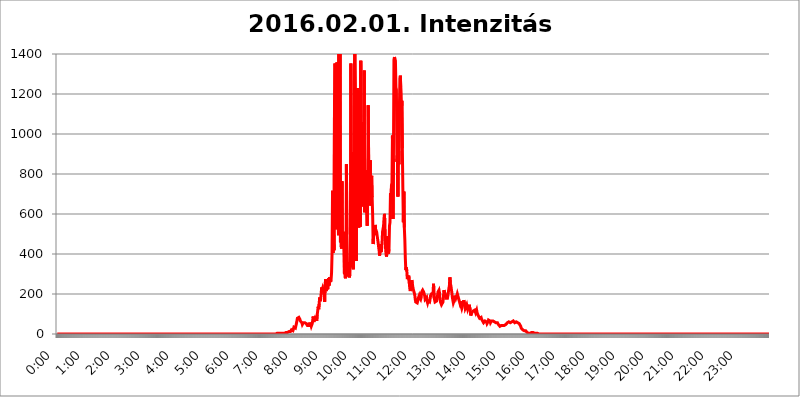
| Category | 2016.02.01. Intenzitás [W/m^2] |
|---|---|
| 0.0 | 0 |
| 0.0006944444444444445 | 0 |
| 0.001388888888888889 | 0 |
| 0.0020833333333333333 | 0 |
| 0.002777777777777778 | 0 |
| 0.003472222222222222 | 0 |
| 0.004166666666666667 | 0 |
| 0.004861111111111111 | 0 |
| 0.005555555555555556 | 0 |
| 0.0062499999999999995 | 0 |
| 0.006944444444444444 | 0 |
| 0.007638888888888889 | 0 |
| 0.008333333333333333 | 0 |
| 0.009027777777777779 | 0 |
| 0.009722222222222222 | 0 |
| 0.010416666666666666 | 0 |
| 0.011111111111111112 | 0 |
| 0.011805555555555555 | 0 |
| 0.012499999999999999 | 0 |
| 0.013194444444444444 | 0 |
| 0.013888888888888888 | 0 |
| 0.014583333333333332 | 0 |
| 0.015277777777777777 | 0 |
| 0.015972222222222224 | 0 |
| 0.016666666666666666 | 0 |
| 0.017361111111111112 | 0 |
| 0.018055555555555557 | 0 |
| 0.01875 | 0 |
| 0.019444444444444445 | 0 |
| 0.02013888888888889 | 0 |
| 0.020833333333333332 | 0 |
| 0.02152777777777778 | 0 |
| 0.022222222222222223 | 0 |
| 0.02291666666666667 | 0 |
| 0.02361111111111111 | 0 |
| 0.024305555555555556 | 0 |
| 0.024999999999999998 | 0 |
| 0.025694444444444447 | 0 |
| 0.02638888888888889 | 0 |
| 0.027083333333333334 | 0 |
| 0.027777777777777776 | 0 |
| 0.02847222222222222 | 0 |
| 0.029166666666666664 | 0 |
| 0.029861111111111113 | 0 |
| 0.030555555555555555 | 0 |
| 0.03125 | 0 |
| 0.03194444444444445 | 0 |
| 0.03263888888888889 | 0 |
| 0.03333333333333333 | 0 |
| 0.034027777777777775 | 0 |
| 0.034722222222222224 | 0 |
| 0.035416666666666666 | 0 |
| 0.036111111111111115 | 0 |
| 0.03680555555555556 | 0 |
| 0.0375 | 0 |
| 0.03819444444444444 | 0 |
| 0.03888888888888889 | 0 |
| 0.03958333333333333 | 0 |
| 0.04027777777777778 | 0 |
| 0.04097222222222222 | 0 |
| 0.041666666666666664 | 0 |
| 0.042361111111111106 | 0 |
| 0.04305555555555556 | 0 |
| 0.043750000000000004 | 0 |
| 0.044444444444444446 | 0 |
| 0.04513888888888889 | 0 |
| 0.04583333333333334 | 0 |
| 0.04652777777777778 | 0 |
| 0.04722222222222222 | 0 |
| 0.04791666666666666 | 0 |
| 0.04861111111111111 | 0 |
| 0.049305555555555554 | 0 |
| 0.049999999999999996 | 0 |
| 0.05069444444444445 | 0 |
| 0.051388888888888894 | 0 |
| 0.052083333333333336 | 0 |
| 0.05277777777777778 | 0 |
| 0.05347222222222222 | 0 |
| 0.05416666666666667 | 0 |
| 0.05486111111111111 | 0 |
| 0.05555555555555555 | 0 |
| 0.05625 | 0 |
| 0.05694444444444444 | 0 |
| 0.057638888888888885 | 0 |
| 0.05833333333333333 | 0 |
| 0.05902777777777778 | 0 |
| 0.059722222222222225 | 0 |
| 0.06041666666666667 | 0 |
| 0.061111111111111116 | 0 |
| 0.06180555555555556 | 0 |
| 0.0625 | 0 |
| 0.06319444444444444 | 0 |
| 0.06388888888888888 | 0 |
| 0.06458333333333334 | 0 |
| 0.06527777777777778 | 0 |
| 0.06597222222222222 | 0 |
| 0.06666666666666667 | 0 |
| 0.06736111111111111 | 0 |
| 0.06805555555555555 | 0 |
| 0.06874999999999999 | 0 |
| 0.06944444444444443 | 0 |
| 0.07013888888888889 | 0 |
| 0.07083333333333333 | 0 |
| 0.07152777777777779 | 0 |
| 0.07222222222222223 | 0 |
| 0.07291666666666667 | 0 |
| 0.07361111111111111 | 0 |
| 0.07430555555555556 | 0 |
| 0.075 | 0 |
| 0.07569444444444444 | 0 |
| 0.0763888888888889 | 0 |
| 0.07708333333333334 | 0 |
| 0.07777777777777778 | 0 |
| 0.07847222222222222 | 0 |
| 0.07916666666666666 | 0 |
| 0.0798611111111111 | 0 |
| 0.08055555555555556 | 0 |
| 0.08125 | 0 |
| 0.08194444444444444 | 0 |
| 0.08263888888888889 | 0 |
| 0.08333333333333333 | 0 |
| 0.08402777777777777 | 0 |
| 0.08472222222222221 | 0 |
| 0.08541666666666665 | 0 |
| 0.08611111111111112 | 0 |
| 0.08680555555555557 | 0 |
| 0.08750000000000001 | 0 |
| 0.08819444444444445 | 0 |
| 0.08888888888888889 | 0 |
| 0.08958333333333333 | 0 |
| 0.09027777777777778 | 0 |
| 0.09097222222222222 | 0 |
| 0.09166666666666667 | 0 |
| 0.09236111111111112 | 0 |
| 0.09305555555555556 | 0 |
| 0.09375 | 0 |
| 0.09444444444444444 | 0 |
| 0.09513888888888888 | 0 |
| 0.09583333333333333 | 0 |
| 0.09652777777777777 | 0 |
| 0.09722222222222222 | 0 |
| 0.09791666666666667 | 0 |
| 0.09861111111111111 | 0 |
| 0.09930555555555555 | 0 |
| 0.09999999999999999 | 0 |
| 0.10069444444444443 | 0 |
| 0.1013888888888889 | 0 |
| 0.10208333333333335 | 0 |
| 0.10277777777777779 | 0 |
| 0.10347222222222223 | 0 |
| 0.10416666666666667 | 0 |
| 0.10486111111111111 | 0 |
| 0.10555555555555556 | 0 |
| 0.10625 | 0 |
| 0.10694444444444444 | 0 |
| 0.1076388888888889 | 0 |
| 0.10833333333333334 | 0 |
| 0.10902777777777778 | 0 |
| 0.10972222222222222 | 0 |
| 0.1111111111111111 | 0 |
| 0.11180555555555556 | 0 |
| 0.11180555555555556 | 0 |
| 0.1125 | 0 |
| 0.11319444444444444 | 0 |
| 0.11388888888888889 | 0 |
| 0.11458333333333333 | 0 |
| 0.11527777777777777 | 0 |
| 0.11597222222222221 | 0 |
| 0.11666666666666665 | 0 |
| 0.1173611111111111 | 0 |
| 0.11805555555555557 | 0 |
| 0.11944444444444445 | 0 |
| 0.12013888888888889 | 0 |
| 0.12083333333333333 | 0 |
| 0.12152777777777778 | 0 |
| 0.12222222222222223 | 0 |
| 0.12291666666666667 | 0 |
| 0.12291666666666667 | 0 |
| 0.12361111111111112 | 0 |
| 0.12430555555555556 | 0 |
| 0.125 | 0 |
| 0.12569444444444444 | 0 |
| 0.12638888888888888 | 0 |
| 0.12708333333333333 | 0 |
| 0.16875 | 0 |
| 0.12847222222222224 | 0 |
| 0.12916666666666668 | 0 |
| 0.12986111111111112 | 0 |
| 0.13055555555555556 | 0 |
| 0.13125 | 0 |
| 0.13194444444444445 | 0 |
| 0.1326388888888889 | 0 |
| 0.13333333333333333 | 0 |
| 0.13402777777777777 | 0 |
| 0.13402777777777777 | 0 |
| 0.13472222222222222 | 0 |
| 0.13541666666666666 | 0 |
| 0.1361111111111111 | 0 |
| 0.13749999999999998 | 0 |
| 0.13819444444444443 | 0 |
| 0.1388888888888889 | 0 |
| 0.13958333333333334 | 0 |
| 0.14027777777777778 | 0 |
| 0.14097222222222222 | 0 |
| 0.14166666666666666 | 0 |
| 0.1423611111111111 | 0 |
| 0.14305555555555557 | 0 |
| 0.14375000000000002 | 0 |
| 0.14444444444444446 | 0 |
| 0.1451388888888889 | 0 |
| 0.1451388888888889 | 0 |
| 0.14652777777777778 | 0 |
| 0.14722222222222223 | 0 |
| 0.14791666666666667 | 0 |
| 0.1486111111111111 | 0 |
| 0.14930555555555555 | 0 |
| 0.15 | 0 |
| 0.15069444444444444 | 0 |
| 0.15138888888888888 | 0 |
| 0.15208333333333332 | 0 |
| 0.15277777777777776 | 0 |
| 0.15347222222222223 | 0 |
| 0.15416666666666667 | 0 |
| 0.15486111111111112 | 0 |
| 0.15555555555555556 | 0 |
| 0.15625 | 0 |
| 0.15694444444444444 | 0 |
| 0.15763888888888888 | 0 |
| 0.15833333333333333 | 0 |
| 0.15902777777777777 | 0 |
| 0.15972222222222224 | 0 |
| 0.16041666666666668 | 0 |
| 0.16111111111111112 | 0 |
| 0.16180555555555556 | 0 |
| 0.1625 | 0 |
| 0.16319444444444445 | 0 |
| 0.1638888888888889 | 0 |
| 0.16458333333333333 | 0 |
| 0.16527777777777777 | 0 |
| 0.16597222222222222 | 0 |
| 0.16666666666666666 | 0 |
| 0.1673611111111111 | 0 |
| 0.16805555555555554 | 0 |
| 0.16874999999999998 | 0 |
| 0.16944444444444443 | 0 |
| 0.17013888888888887 | 0 |
| 0.1708333333333333 | 0 |
| 0.17152777777777775 | 0 |
| 0.17222222222222225 | 0 |
| 0.1729166666666667 | 0 |
| 0.17361111111111113 | 0 |
| 0.17430555555555557 | 0 |
| 0.17500000000000002 | 0 |
| 0.17569444444444446 | 0 |
| 0.1763888888888889 | 0 |
| 0.17708333333333334 | 0 |
| 0.17777777777777778 | 0 |
| 0.17847222222222223 | 0 |
| 0.17916666666666667 | 0 |
| 0.1798611111111111 | 0 |
| 0.18055555555555555 | 0 |
| 0.18125 | 0 |
| 0.18194444444444444 | 0 |
| 0.1826388888888889 | 0 |
| 0.18333333333333335 | 0 |
| 0.1840277777777778 | 0 |
| 0.18472222222222223 | 0 |
| 0.18541666666666667 | 0 |
| 0.18611111111111112 | 0 |
| 0.18680555555555556 | 0 |
| 0.1875 | 0 |
| 0.18819444444444444 | 0 |
| 0.18888888888888888 | 0 |
| 0.18958333333333333 | 0 |
| 0.19027777777777777 | 0 |
| 0.1909722222222222 | 0 |
| 0.19166666666666665 | 0 |
| 0.19236111111111112 | 0 |
| 0.19305555555555554 | 0 |
| 0.19375 | 0 |
| 0.19444444444444445 | 0 |
| 0.1951388888888889 | 0 |
| 0.19583333333333333 | 0 |
| 0.19652777777777777 | 0 |
| 0.19722222222222222 | 0 |
| 0.19791666666666666 | 0 |
| 0.1986111111111111 | 0 |
| 0.19930555555555554 | 0 |
| 0.19999999999999998 | 0 |
| 0.20069444444444443 | 0 |
| 0.20138888888888887 | 0 |
| 0.2020833333333333 | 0 |
| 0.2027777777777778 | 0 |
| 0.2034722222222222 | 0 |
| 0.2041666666666667 | 0 |
| 0.20486111111111113 | 0 |
| 0.20555555555555557 | 0 |
| 0.20625000000000002 | 0 |
| 0.20694444444444446 | 0 |
| 0.2076388888888889 | 0 |
| 0.20833333333333334 | 0 |
| 0.20902777777777778 | 0 |
| 0.20972222222222223 | 0 |
| 0.21041666666666667 | 0 |
| 0.2111111111111111 | 0 |
| 0.21180555555555555 | 0 |
| 0.2125 | 0 |
| 0.21319444444444444 | 0 |
| 0.2138888888888889 | 0 |
| 0.21458333333333335 | 0 |
| 0.2152777777777778 | 0 |
| 0.21597222222222223 | 0 |
| 0.21666666666666667 | 0 |
| 0.21736111111111112 | 0 |
| 0.21805555555555556 | 0 |
| 0.21875 | 0 |
| 0.21944444444444444 | 0 |
| 0.22013888888888888 | 0 |
| 0.22083333333333333 | 0 |
| 0.22152777777777777 | 0 |
| 0.2222222222222222 | 0 |
| 0.22291666666666665 | 0 |
| 0.2236111111111111 | 0 |
| 0.22430555555555556 | 0 |
| 0.225 | 0 |
| 0.22569444444444445 | 0 |
| 0.2263888888888889 | 0 |
| 0.22708333333333333 | 0 |
| 0.22777777777777777 | 0 |
| 0.22847222222222222 | 0 |
| 0.22916666666666666 | 0 |
| 0.2298611111111111 | 0 |
| 0.23055555555555554 | 0 |
| 0.23124999999999998 | 0 |
| 0.23194444444444443 | 0 |
| 0.23263888888888887 | 0 |
| 0.2333333333333333 | 0 |
| 0.2340277777777778 | 0 |
| 0.2347222222222222 | 0 |
| 0.2354166666666667 | 0 |
| 0.23611111111111113 | 0 |
| 0.23680555555555557 | 0 |
| 0.23750000000000002 | 0 |
| 0.23819444444444446 | 0 |
| 0.2388888888888889 | 0 |
| 0.23958333333333334 | 0 |
| 0.24027777777777778 | 0 |
| 0.24097222222222223 | 0 |
| 0.24166666666666667 | 0 |
| 0.2423611111111111 | 0 |
| 0.24305555555555555 | 0 |
| 0.24375 | 0 |
| 0.24444444444444446 | 0 |
| 0.24513888888888888 | 0 |
| 0.24583333333333335 | 0 |
| 0.2465277777777778 | 0 |
| 0.24722222222222223 | 0 |
| 0.24791666666666667 | 0 |
| 0.24861111111111112 | 0 |
| 0.24930555555555556 | 0 |
| 0.25 | 0 |
| 0.25069444444444444 | 0 |
| 0.2513888888888889 | 0 |
| 0.2520833333333333 | 0 |
| 0.25277777777777777 | 0 |
| 0.2534722222222222 | 0 |
| 0.25416666666666665 | 0 |
| 0.2548611111111111 | 0 |
| 0.2555555555555556 | 0 |
| 0.25625000000000003 | 0 |
| 0.2569444444444445 | 0 |
| 0.2576388888888889 | 0 |
| 0.25833333333333336 | 0 |
| 0.2590277777777778 | 0 |
| 0.25972222222222224 | 0 |
| 0.2604166666666667 | 0 |
| 0.2611111111111111 | 0 |
| 0.26180555555555557 | 0 |
| 0.2625 | 0 |
| 0.26319444444444445 | 0 |
| 0.2638888888888889 | 0 |
| 0.26458333333333334 | 0 |
| 0.2652777777777778 | 0 |
| 0.2659722222222222 | 0 |
| 0.26666666666666666 | 0 |
| 0.2673611111111111 | 0 |
| 0.26805555555555555 | 0 |
| 0.26875 | 0 |
| 0.26944444444444443 | 0 |
| 0.2701388888888889 | 0 |
| 0.2708333333333333 | 0 |
| 0.27152777777777776 | 0 |
| 0.2722222222222222 | 0 |
| 0.27291666666666664 | 0 |
| 0.2736111111111111 | 0 |
| 0.2743055555555555 | 0 |
| 0.27499999999999997 | 0 |
| 0.27569444444444446 | 0 |
| 0.27638888888888885 | 0 |
| 0.27708333333333335 | 0 |
| 0.2777777777777778 | 0 |
| 0.27847222222222223 | 0 |
| 0.2791666666666667 | 0 |
| 0.2798611111111111 | 0 |
| 0.28055555555555556 | 0 |
| 0.28125 | 0 |
| 0.28194444444444444 | 0 |
| 0.2826388888888889 | 0 |
| 0.2833333333333333 | 0 |
| 0.28402777777777777 | 0 |
| 0.2847222222222222 | 0 |
| 0.28541666666666665 | 0 |
| 0.28611111111111115 | 0 |
| 0.28680555555555554 | 0 |
| 0.28750000000000003 | 0 |
| 0.2881944444444445 | 0 |
| 0.2888888888888889 | 0 |
| 0.28958333333333336 | 0 |
| 0.2902777777777778 | 0 |
| 0.29097222222222224 | 0 |
| 0.2916666666666667 | 0 |
| 0.2923611111111111 | 0 |
| 0.29305555555555557 | 0 |
| 0.29375 | 0 |
| 0.29444444444444445 | 0 |
| 0.2951388888888889 | 0 |
| 0.29583333333333334 | 0 |
| 0.2965277777777778 | 0 |
| 0.2972222222222222 | 0 |
| 0.29791666666666666 | 0 |
| 0.2986111111111111 | 0 |
| 0.29930555555555555 | 0 |
| 0.3 | 0 |
| 0.30069444444444443 | 0 |
| 0.3013888888888889 | 0 |
| 0.3020833333333333 | 0 |
| 0.30277777777777776 | 0 |
| 0.3034722222222222 | 0 |
| 0.30416666666666664 | 0 |
| 0.3048611111111111 | 0 |
| 0.3055555555555555 | 0 |
| 0.30624999999999997 | 0 |
| 0.3069444444444444 | 0 |
| 0.3076388888888889 | 3.525 |
| 0.30833333333333335 | 3.525 |
| 0.3090277777777778 | 3.525 |
| 0.30972222222222223 | 3.525 |
| 0.3104166666666667 | 3.525 |
| 0.3111111111111111 | 3.525 |
| 0.31180555555555556 | 3.525 |
| 0.3125 | 3.525 |
| 0.31319444444444444 | 3.525 |
| 0.3138888888888889 | 3.525 |
| 0.3145833333333333 | 3.525 |
| 0.31527777777777777 | 3.525 |
| 0.3159722222222222 | 3.525 |
| 0.31666666666666665 | 3.525 |
| 0.31736111111111115 | 3.525 |
| 0.31805555555555554 | 3.525 |
| 0.31875000000000003 | 3.525 |
| 0.3194444444444445 | 3.525 |
| 0.3201388888888889 | 7.887 |
| 0.32083333333333336 | 7.887 |
| 0.3215277777777778 | 7.887 |
| 0.32222222222222224 | 7.887 |
| 0.3229166666666667 | 7.887 |
| 0.3236111111111111 | 12.257 |
| 0.32430555555555557 | 12.257 |
| 0.325 | 12.257 |
| 0.32569444444444445 | 12.257 |
| 0.3263888888888889 | 16.636 |
| 0.32708333333333334 | 12.257 |
| 0.3277777777777778 | 16.636 |
| 0.3284722222222222 | 21.024 |
| 0.32916666666666666 | 21.024 |
| 0.3298611111111111 | 16.636 |
| 0.33055555555555555 | 16.636 |
| 0.33125 | 21.024 |
| 0.33194444444444443 | 34.234 |
| 0.3326388888888889 | 34.234 |
| 0.3333333333333333 | 29.823 |
| 0.3340277777777778 | 29.823 |
| 0.3347222222222222 | 34.234 |
| 0.3354166666666667 | 51.951 |
| 0.3361111111111111 | 65.31 |
| 0.3368055555555556 | 78.722 |
| 0.33749999999999997 | 74.246 |
| 0.33819444444444446 | 78.722 |
| 0.33888888888888885 | 83.205 |
| 0.33958333333333335 | 83.205 |
| 0.34027777777777773 | 74.246 |
| 0.34097222222222223 | 65.31 |
| 0.3416666666666666 | 65.31 |
| 0.3423611111111111 | 60.85 |
| 0.3430555555555555 | 56.398 |
| 0.34375 | 47.511 |
| 0.3444444444444445 | 51.951 |
| 0.3451388888888889 | 56.398 |
| 0.3458333333333334 | 51.951 |
| 0.34652777777777777 | 60.85 |
| 0.34722222222222227 | 56.398 |
| 0.34791666666666665 | 56.398 |
| 0.34861111111111115 | 56.398 |
| 0.34930555555555554 | 51.951 |
| 0.35000000000000003 | 47.511 |
| 0.3506944444444444 | 43.079 |
| 0.3513888888888889 | 47.511 |
| 0.3520833333333333 | 47.511 |
| 0.3527777777777778 | 43.079 |
| 0.3534722222222222 | 56.398 |
| 0.3541666666666667 | 38.653 |
| 0.3548611111111111 | 56.398 |
| 0.35555555555555557 | 47.511 |
| 0.35625 | 38.653 |
| 0.35694444444444445 | 38.653 |
| 0.3576388888888889 | 51.951 |
| 0.35833333333333334 | 56.398 |
| 0.3590277777777778 | 87.692 |
| 0.3597222222222222 | 60.85 |
| 0.36041666666666666 | 56.398 |
| 0.3611111111111111 | 74.246 |
| 0.36180555555555555 | 65.31 |
| 0.3625 | 87.692 |
| 0.36319444444444443 | 78.722 |
| 0.3638888888888889 | 65.31 |
| 0.3645833333333333 | 96.682 |
| 0.3652777777777778 | 114.716 |
| 0.3659722222222222 | 137.347 |
| 0.3666666666666667 | 123.758 |
| 0.3673611111111111 | 150.964 |
| 0.3680555555555556 | 182.82 |
| 0.36874999999999997 | 164.605 |
| 0.36944444444444446 | 173.709 |
| 0.37013888888888885 | 201.058 |
| 0.37083333333333335 | 233 |
| 0.37152777777777773 | 219.309 |
| 0.37222222222222223 | 228.436 |
| 0.3729166666666666 | 219.309 |
| 0.3736111111111111 | 219.309 |
| 0.3743055555555555 | 233 |
| 0.375 | 160.056 |
| 0.3756944444444445 | 246.689 |
| 0.3763888888888889 | 274.047 |
| 0.3770833333333334 | 214.746 |
| 0.37777777777777777 | 219.309 |
| 0.37847222222222227 | 242.127 |
| 0.37916666666666665 | 223.873 |
| 0.37986111111111115 | 233 |
| 0.38055555555555554 | 278.603 |
| 0.38125000000000003 | 242.127 |
| 0.3819444444444444 | 283.156 |
| 0.3826388888888889 | 287.709 |
| 0.3833333333333333 | 260.373 |
| 0.3840277777777778 | 269.49 |
| 0.3847222222222222 | 305.898 |
| 0.3854166666666667 | 400.638 |
| 0.3861111111111111 | 715.858 |
| 0.38680555555555557 | 405.108 |
| 0.3875 | 515.223 |
| 0.38819444444444445 | 418.492 |
| 0.3888888888888889 | 1166.46 |
| 0.38958333333333334 | 1352.994 |
| 0.3902777777777778 | 679.395 |
| 0.3909722222222222 | 1339.639 |
| 0.39166666666666666 | 523.88 |
| 0.3923611111111111 | 1357.483 |
| 0.39305555555555555 | 1283.541 |
| 0.39375 | 604.864 |
| 0.39444444444444443 | 493.475 |
| 0.3951388888888889 | 1403.469 |
| 0.3958333333333333 | 523.88 |
| 0.3965277777777778 | 1408.184 |
| 0.3972222222222222 | 458.38 |
| 0.3979166666666667 | 475.972 |
| 0.3986111111111111 | 427.39 |
| 0.3993055555555556 | 763.674 |
| 0.39999999999999997 | 440.702 |
| 0.40069444444444446 | 436.27 |
| 0.40138888888888885 | 471.582 |
| 0.40208333333333335 | 510.885 |
| 0.40277777777777773 | 301.354 |
| 0.40347222222222223 | 310.44 |
| 0.4041666666666666 | 278.603 |
| 0.4048611111111111 | 328.584 |
| 0.4055555555555555 | 849.199 |
| 0.40625 | 497.836 |
| 0.4069444444444445 | 360.221 |
| 0.4076388888888889 | 287.709 |
| 0.4083333333333334 | 310.44 |
| 0.40902777777777777 | 360.221 |
| 0.40972222222222227 | 283.156 |
| 0.41041666666666665 | 296.808 |
| 0.41111111111111115 | 405.108 |
| 0.41180555555555554 | 1352.994 |
| 0.41250000000000003 | 382.715 |
| 0.4131944444444444 | 333.113 |
| 0.4138888888888889 | 351.198 |
| 0.4145833333333333 | 909.996 |
| 0.4152777777777778 | 324.052 |
| 0.4159722222222222 | 418.492 |
| 0.4166666666666667 | 1322.082 |
| 0.4173611111111111 | 1422.462 |
| 0.41805555555555557 | 1178.177 |
| 0.41875 | 449.551 |
| 0.41944444444444445 | 364.728 |
| 0.4201388888888889 | 1108.816 |
| 0.42083333333333334 | 1229.899 |
| 0.4215277777777778 | 536.82 |
| 0.4222222222222222 | 921.298 |
| 0.42291666666666666 | 532.513 |
| 0.4236111111111111 | 1217.812 |
| 0.42430555555555555 | 1189.969 |
| 0.425 | 536.82 |
| 0.42569444444444443 | 1366.519 |
| 0.4263888888888889 | 723.889 |
| 0.4270833333333333 | 638.256 |
| 0.4277777777777778 | 791.169 |
| 0.4284722222222222 | 1059.756 |
| 0.4291666666666667 | 638.256 |
| 0.4298611111111111 | 687.544 |
| 0.4305555555555556 | 1317.736 |
| 0.43124999999999997 | 609.062 |
| 0.43194444444444446 | 679.395 |
| 0.43263888888888885 | 629.948 |
| 0.43333333333333335 | 818.392 |
| 0.43402777777777773 | 604.864 |
| 0.43472222222222223 | 541.121 |
| 0.4354166666666666 | 755.766 |
| 0.4361111111111111 | 1143.232 |
| 0.4368055555555555 | 845.365 |
| 0.4375 | 795.074 |
| 0.4381944444444445 | 691.608 |
| 0.4388888888888889 | 868.305 |
| 0.4395833333333334 | 642.4 |
| 0.44027777777777777 | 711.832 |
| 0.44097222222222227 | 791.169 |
| 0.44166666666666665 | 683.473 |
| 0.44236111111111115 | 596.45 |
| 0.44305555555555554 | 449.551 |
| 0.44375000000000003 | 506.542 |
| 0.4444444444444444 | 510.885 |
| 0.4451388888888889 | 493.475 |
| 0.4458333333333333 | 545.416 |
| 0.4465277777777778 | 523.88 |
| 0.4472222222222222 | 523.88 |
| 0.4479166666666667 | 510.885 |
| 0.4486111111111111 | 515.223 |
| 0.44930555555555557 | 515.223 |
| 0.45 | 458.38 |
| 0.45069444444444445 | 436.27 |
| 0.4513888888888889 | 418.492 |
| 0.45208333333333334 | 391.685 |
| 0.4527777777777778 | 414.035 |
| 0.4534722222222222 | 449.551 |
| 0.45416666666666666 | 409.574 |
| 0.4548611111111111 | 422.943 |
| 0.45555555555555555 | 458.38 |
| 0.45625 | 510.885 |
| 0.45694444444444443 | 515.223 |
| 0.4576388888888889 | 541.121 |
| 0.4583333333333333 | 579.542 |
| 0.4590277777777778 | 600.661 |
| 0.4597222222222222 | 489.108 |
| 0.4604166666666667 | 431.833 |
| 0.4611111111111111 | 400.638 |
| 0.4618055555555556 | 387.202 |
| 0.46249999999999997 | 409.574 |
| 0.46319444444444446 | 489.108 |
| 0.46388888888888885 | 467.187 |
| 0.46458333333333335 | 400.638 |
| 0.46527777777777773 | 422.943 |
| 0.46597222222222223 | 541.121 |
| 0.4666666666666666 | 558.261 |
| 0.4673611111111111 | 703.762 |
| 0.4680555555555555 | 650.667 |
| 0.46875 | 743.859 |
| 0.4694444444444445 | 755.766 |
| 0.4701388888888889 | 992.448 |
| 0.4708333333333334 | 575.299 |
| 0.47152777777777777 | 875.918 |
| 0.47222222222222227 | 1371.066 |
| 0.47291666666666665 | 1384.828 |
| 0.47361111111111115 | 1375.633 |
| 0.47430555555555554 | 1366.519 |
| 0.47500000000000003 | 1233.951 |
| 0.4756944444444444 | 1221.83 |
| 0.4763888888888889 | 860.676 |
| 0.4770833333333333 | 894.885 |
| 0.4777777777777778 | 687.544 |
| 0.4784722222222222 | 973.772 |
| 0.4791666666666667 | 849.199 |
| 0.4798611111111111 | 1124.056 |
| 0.48055555555555557 | 1275.142 |
| 0.48125 | 1291.997 |
| 0.48194444444444445 | 1296.248 |
| 0.4826388888888889 | 1112.618 |
| 0.48333333333333334 | 1166.46 |
| 0.4840277777777778 | 928.819 |
| 0.4847222222222222 | 727.896 |
| 0.48541666666666666 | 558.261 |
| 0.4861111111111111 | 711.832 |
| 0.48680555555555555 | 532.513 |
| 0.4875 | 471.582 |
| 0.48819444444444443 | 378.224 |
| 0.4888888888888889 | 319.517 |
| 0.4895833333333333 | 333.113 |
| 0.4902777777777778 | 314.98 |
| 0.4909722222222222 | 274.047 |
| 0.4916666666666667 | 269.49 |
| 0.4923611111111111 | 269.49 |
| 0.4930555555555556 | 292.259 |
| 0.49374999999999997 | 255.813 |
| 0.49444444444444446 | 228.436 |
| 0.49513888888888885 | 214.746 |
| 0.49583333333333335 | 219.309 |
| 0.49652777777777773 | 246.689 |
| 0.49722222222222223 | 269.49 |
| 0.4979166666666666 | 255.813 |
| 0.4986111111111111 | 237.564 |
| 0.4993055555555555 | 223.873 |
| 0.5 | 214.746 |
| 0.5006944444444444 | 205.62 |
| 0.5013888888888889 | 196.497 |
| 0.5020833333333333 | 173.709 |
| 0.5027777777777778 | 160.056 |
| 0.5034722222222222 | 155.509 |
| 0.5041666666666667 | 155.509 |
| 0.5048611111111111 | 155.509 |
| 0.5055555555555555 | 164.605 |
| 0.50625 | 178.264 |
| 0.5069444444444444 | 182.82 |
| 0.5076388888888889 | 191.937 |
| 0.5083333333333333 | 182.82 |
| 0.5090277777777777 | 178.264 |
| 0.5097222222222222 | 173.709 |
| 0.5104166666666666 | 182.82 |
| 0.5111111111111112 | 210.182 |
| 0.5118055555555555 | 214.746 |
| 0.5125000000000001 | 219.309 |
| 0.5131944444444444 | 214.746 |
| 0.513888888888889 | 210.182 |
| 0.5145833333333333 | 210.182 |
| 0.5152777777777778 | 191.937 |
| 0.5159722222222222 | 173.709 |
| 0.5166666666666667 | 169.156 |
| 0.517361111111111 | 178.264 |
| 0.5180555555555556 | 182.82 |
| 0.5187499999999999 | 164.605 |
| 0.5194444444444445 | 155.509 |
| 0.5201388888888888 | 164.605 |
| 0.5208333333333334 | 164.605 |
| 0.5215277777777778 | 160.056 |
| 0.5222222222222223 | 160.056 |
| 0.5229166666666667 | 173.709 |
| 0.5236111111111111 | 191.937 |
| 0.5243055555555556 | 196.497 |
| 0.525 | 201.058 |
| 0.5256944444444445 | 196.497 |
| 0.5263888888888889 | 201.058 |
| 0.5270833333333333 | 205.62 |
| 0.5277777777777778 | 251.251 |
| 0.5284722222222222 | 182.82 |
| 0.5291666666666667 | 187.378 |
| 0.5298611111111111 | 160.056 |
| 0.5305555555555556 | 155.509 |
| 0.53125 | 155.509 |
| 0.5319444444444444 | 164.605 |
| 0.5326388888888889 | 182.82 |
| 0.5333333333333333 | 191.937 |
| 0.5340277777777778 | 210.182 |
| 0.5347222222222222 | 210.182 |
| 0.5354166666666667 | 219.309 |
| 0.5361111111111111 | 205.62 |
| 0.5368055555555555 | 173.709 |
| 0.5375 | 160.056 |
| 0.5381944444444444 | 155.509 |
| 0.5388888888888889 | 146.423 |
| 0.5395833333333333 | 146.423 |
| 0.5402777777777777 | 146.423 |
| 0.5409722222222222 | 160.056 |
| 0.5416666666666666 | 187.378 |
| 0.5423611111111112 | 219.309 |
| 0.5430555555555555 | 223.873 |
| 0.5437500000000001 | 214.746 |
| 0.5444444444444444 | 191.937 |
| 0.545138888888889 | 178.264 |
| 0.5458333333333333 | 178.264 |
| 0.5465277777777778 | 173.709 |
| 0.5472222222222222 | 178.264 |
| 0.5479166666666667 | 191.937 |
| 0.548611111111111 | 196.497 |
| 0.5493055555555556 | 228.436 |
| 0.5499999999999999 | 242.127 |
| 0.5506944444444445 | 283.156 |
| 0.5513888888888888 | 251.251 |
| 0.5520833333333334 | 242.127 |
| 0.5527777777777778 | 237.564 |
| 0.5534722222222223 | 205.62 |
| 0.5541666666666667 | 182.82 |
| 0.5548611111111111 | 169.156 |
| 0.5555555555555556 | 155.509 |
| 0.55625 | 160.056 |
| 0.5569444444444445 | 169.156 |
| 0.5576388888888889 | 191.937 |
| 0.5583333333333333 | 187.378 |
| 0.5590277777777778 | 178.264 |
| 0.5597222222222222 | 182.82 |
| 0.5604166666666667 | 191.937 |
| 0.5611111111111111 | 201.058 |
| 0.5618055555555556 | 196.497 |
| 0.5625 | 182.82 |
| 0.5631944444444444 | 187.378 |
| 0.5638888888888889 | 182.82 |
| 0.5645833333333333 | 155.509 |
| 0.5652777777777778 | 164.605 |
| 0.5659722222222222 | 146.423 |
| 0.5666666666666667 | 137.347 |
| 0.5673611111111111 | 128.284 |
| 0.5680555555555555 | 137.347 |
| 0.56875 | 141.884 |
| 0.5694444444444444 | 155.509 |
| 0.5701388888888889 | 169.156 |
| 0.5708333333333333 | 173.709 |
| 0.5715277777777777 | 146.423 |
| 0.5722222222222222 | 128.284 |
| 0.5729166666666666 | 123.758 |
| 0.5736111111111112 | 128.284 |
| 0.5743055555555555 | 146.423 |
| 0.5750000000000001 | 146.423 |
| 0.5756944444444444 | 123.758 |
| 0.576388888888889 | 119.235 |
| 0.5770833333333333 | 123.758 |
| 0.5777777777777778 | 146.423 |
| 0.5784722222222222 | 141.884 |
| 0.5791666666666667 | 119.235 |
| 0.579861111111111 | 92.184 |
| 0.5805555555555556 | 92.184 |
| 0.5812499999999999 | 105.69 |
| 0.5819444444444445 | 105.69 |
| 0.5826388888888888 | 101.184 |
| 0.5833333333333334 | 114.716 |
| 0.5840277777777778 | 119.235 |
| 0.5847222222222223 | 119.235 |
| 0.5854166666666667 | 119.235 |
| 0.5861111111111111 | 119.235 |
| 0.5868055555555556 | 105.69 |
| 0.5875 | 110.201 |
| 0.5881944444444445 | 119.235 |
| 0.5888888888888889 | 105.69 |
| 0.5895833333333333 | 101.184 |
| 0.5902777777777778 | 101.184 |
| 0.5909722222222222 | 87.692 |
| 0.5916666666666667 | 83.205 |
| 0.5923611111111111 | 78.722 |
| 0.5930555555555556 | 74.246 |
| 0.59375 | 78.722 |
| 0.5944444444444444 | 83.205 |
| 0.5951388888888889 | 74.246 |
| 0.5958333333333333 | 74.246 |
| 0.5965277777777778 | 65.31 |
| 0.5972222222222222 | 60.85 |
| 0.5979166666666667 | 56.398 |
| 0.5986111111111111 | 56.398 |
| 0.5993055555555555 | 60.85 |
| 0.6 | 65.31 |
| 0.6006944444444444 | 65.31 |
| 0.6013888888888889 | 65.31 |
| 0.6020833333333333 | 60.85 |
| 0.6027777777777777 | 51.951 |
| 0.6034722222222222 | 56.398 |
| 0.6041666666666666 | 60.85 |
| 0.6048611111111112 | 69.775 |
| 0.6055555555555555 | 74.246 |
| 0.6062500000000001 | 74.246 |
| 0.6069444444444444 | 65.31 |
| 0.607638888888889 | 56.398 |
| 0.6083333333333333 | 56.398 |
| 0.6090277777777778 | 65.31 |
| 0.6097222222222222 | 60.85 |
| 0.6104166666666667 | 65.31 |
| 0.611111111111111 | 65.31 |
| 0.6118055555555556 | 60.85 |
| 0.6124999999999999 | 60.85 |
| 0.6131944444444445 | 60.85 |
| 0.6138888888888888 | 60.85 |
| 0.6145833333333334 | 60.85 |
| 0.6152777777777778 | 56.398 |
| 0.6159722222222223 | 56.398 |
| 0.6166666666666667 | 60.85 |
| 0.6173611111111111 | 56.398 |
| 0.6180555555555556 | 51.951 |
| 0.61875 | 47.511 |
| 0.6194444444444445 | 47.511 |
| 0.6201388888888889 | 43.079 |
| 0.6208333333333333 | 38.653 |
| 0.6215277777777778 | 38.653 |
| 0.6222222222222222 | 43.079 |
| 0.6229166666666667 | 43.079 |
| 0.6236111111111111 | 43.079 |
| 0.6243055555555556 | 43.079 |
| 0.625 | 43.079 |
| 0.6256944444444444 | 38.653 |
| 0.6263888888888889 | 43.079 |
| 0.6270833333333333 | 43.079 |
| 0.6277777777777778 | 43.079 |
| 0.6284722222222222 | 43.079 |
| 0.6291666666666667 | 47.511 |
| 0.6298611111111111 | 47.511 |
| 0.6305555555555555 | 51.951 |
| 0.63125 | 56.398 |
| 0.6319444444444444 | 56.398 |
| 0.6326388888888889 | 56.398 |
| 0.6333333333333333 | 60.85 |
| 0.6340277777777777 | 60.85 |
| 0.6347222222222222 | 60.85 |
| 0.6354166666666666 | 56.398 |
| 0.6361111111111112 | 56.398 |
| 0.6368055555555555 | 56.398 |
| 0.6375000000000001 | 60.85 |
| 0.6381944444444444 | 60.85 |
| 0.638888888888889 | 60.85 |
| 0.6395833333333333 | 65.31 |
| 0.6402777777777778 | 60.85 |
| 0.6409722222222222 | 60.85 |
| 0.6416666666666667 | 56.398 |
| 0.642361111111111 | 56.398 |
| 0.6430555555555556 | 60.85 |
| 0.6437499999999999 | 60.85 |
| 0.6444444444444445 | 60.85 |
| 0.6451388888888888 | 60.85 |
| 0.6458333333333334 | 56.398 |
| 0.6465277777777778 | 56.398 |
| 0.6472222222222223 | 56.398 |
| 0.6479166666666667 | 51.951 |
| 0.6486111111111111 | 47.511 |
| 0.6493055555555556 | 47.511 |
| 0.65 | 38.653 |
| 0.6506944444444445 | 29.823 |
| 0.6513888888888889 | 29.823 |
| 0.6520833333333333 | 25.419 |
| 0.6527777777777778 | 21.024 |
| 0.6534722222222222 | 16.636 |
| 0.6541666666666667 | 16.636 |
| 0.6548611111111111 | 16.636 |
| 0.6555555555555556 | 16.636 |
| 0.65625 | 16.636 |
| 0.6569444444444444 | 16.636 |
| 0.6576388888888889 | 16.636 |
| 0.6583333333333333 | 12.257 |
| 0.6590277777777778 | 7.887 |
| 0.6597222222222222 | 7.887 |
| 0.6604166666666667 | 7.887 |
| 0.6611111111111111 | 3.525 |
| 0.6618055555555555 | 3.525 |
| 0.6625 | 3.525 |
| 0.6631944444444444 | 3.525 |
| 0.6638888888888889 | 3.525 |
| 0.6645833333333333 | 7.887 |
| 0.6652777777777777 | 7.887 |
| 0.6659722222222222 | 7.887 |
| 0.6666666666666666 | 7.887 |
| 0.6673611111111111 | 7.887 |
| 0.6680555555555556 | 7.887 |
| 0.6687500000000001 | 3.525 |
| 0.6694444444444444 | 3.525 |
| 0.6701388888888888 | 3.525 |
| 0.6708333333333334 | 3.525 |
| 0.6715277777777778 | 3.525 |
| 0.6722222222222222 | 3.525 |
| 0.6729166666666666 | 3.525 |
| 0.6736111111111112 | 3.525 |
| 0.6743055555555556 | 3.525 |
| 0.6749999999999999 | 3.525 |
| 0.6756944444444444 | 0 |
| 0.6763888888888889 | 0 |
| 0.6770833333333334 | 0 |
| 0.6777777777777777 | 0 |
| 0.6784722222222223 | 0 |
| 0.6791666666666667 | 0 |
| 0.6798611111111111 | 0 |
| 0.6805555555555555 | 0 |
| 0.68125 | 0 |
| 0.6819444444444445 | 0 |
| 0.6826388888888889 | 0 |
| 0.6833333333333332 | 0 |
| 0.6840277777777778 | 0 |
| 0.6847222222222222 | 0 |
| 0.6854166666666667 | 0 |
| 0.686111111111111 | 0 |
| 0.6868055555555556 | 0 |
| 0.6875 | 0 |
| 0.6881944444444444 | 0 |
| 0.688888888888889 | 0 |
| 0.6895833333333333 | 0 |
| 0.6902777777777778 | 0 |
| 0.6909722222222222 | 0 |
| 0.6916666666666668 | 0 |
| 0.6923611111111111 | 0 |
| 0.6930555555555555 | 0 |
| 0.69375 | 0 |
| 0.6944444444444445 | 0 |
| 0.6951388888888889 | 0 |
| 0.6958333333333333 | 0 |
| 0.6965277777777777 | 0 |
| 0.6972222222222223 | 0 |
| 0.6979166666666666 | 0 |
| 0.6986111111111111 | 0 |
| 0.6993055555555556 | 0 |
| 0.7000000000000001 | 0 |
| 0.7006944444444444 | 0 |
| 0.7013888888888888 | 0 |
| 0.7020833333333334 | 0 |
| 0.7027777777777778 | 0 |
| 0.7034722222222222 | 0 |
| 0.7041666666666666 | 0 |
| 0.7048611111111112 | 0 |
| 0.7055555555555556 | 0 |
| 0.7062499999999999 | 0 |
| 0.7069444444444444 | 0 |
| 0.7076388888888889 | 0 |
| 0.7083333333333334 | 0 |
| 0.7090277777777777 | 0 |
| 0.7097222222222223 | 0 |
| 0.7104166666666667 | 0 |
| 0.7111111111111111 | 0 |
| 0.7118055555555555 | 0 |
| 0.7125 | 0 |
| 0.7131944444444445 | 0 |
| 0.7138888888888889 | 0 |
| 0.7145833333333332 | 0 |
| 0.7152777777777778 | 0 |
| 0.7159722222222222 | 0 |
| 0.7166666666666667 | 0 |
| 0.717361111111111 | 0 |
| 0.7180555555555556 | 0 |
| 0.71875 | 0 |
| 0.7194444444444444 | 0 |
| 0.720138888888889 | 0 |
| 0.7208333333333333 | 0 |
| 0.7215277777777778 | 0 |
| 0.7222222222222222 | 0 |
| 0.7229166666666668 | 0 |
| 0.7236111111111111 | 0 |
| 0.7243055555555555 | 0 |
| 0.725 | 0 |
| 0.7256944444444445 | 0 |
| 0.7263888888888889 | 0 |
| 0.7270833333333333 | 0 |
| 0.7277777777777777 | 0 |
| 0.7284722222222223 | 0 |
| 0.7291666666666666 | 0 |
| 0.7298611111111111 | 0 |
| 0.7305555555555556 | 0 |
| 0.7312500000000001 | 0 |
| 0.7319444444444444 | 0 |
| 0.7326388888888888 | 0 |
| 0.7333333333333334 | 0 |
| 0.7340277777777778 | 0 |
| 0.7347222222222222 | 0 |
| 0.7354166666666666 | 0 |
| 0.7361111111111112 | 0 |
| 0.7368055555555556 | 0 |
| 0.7374999999999999 | 0 |
| 0.7381944444444444 | 0 |
| 0.7388888888888889 | 0 |
| 0.7395833333333334 | 0 |
| 0.7402777777777777 | 0 |
| 0.7409722222222223 | 0 |
| 0.7416666666666667 | 0 |
| 0.7423611111111111 | 0 |
| 0.7430555555555555 | 0 |
| 0.74375 | 0 |
| 0.7444444444444445 | 0 |
| 0.7451388888888889 | 0 |
| 0.7458333333333332 | 0 |
| 0.7465277777777778 | 0 |
| 0.7472222222222222 | 0 |
| 0.7479166666666667 | 0 |
| 0.748611111111111 | 0 |
| 0.7493055555555556 | 0 |
| 0.75 | 0 |
| 0.7506944444444444 | 0 |
| 0.751388888888889 | 0 |
| 0.7520833333333333 | 0 |
| 0.7527777777777778 | 0 |
| 0.7534722222222222 | 0 |
| 0.7541666666666668 | 0 |
| 0.7548611111111111 | 0 |
| 0.7555555555555555 | 0 |
| 0.75625 | 0 |
| 0.7569444444444445 | 0 |
| 0.7576388888888889 | 0 |
| 0.7583333333333333 | 0 |
| 0.7590277777777777 | 0 |
| 0.7597222222222223 | 0 |
| 0.7604166666666666 | 0 |
| 0.7611111111111111 | 0 |
| 0.7618055555555556 | 0 |
| 0.7625000000000001 | 0 |
| 0.7631944444444444 | 0 |
| 0.7638888888888888 | 0 |
| 0.7645833333333334 | 0 |
| 0.7652777777777778 | 0 |
| 0.7659722222222222 | 0 |
| 0.7666666666666666 | 0 |
| 0.7673611111111112 | 0 |
| 0.7680555555555556 | 0 |
| 0.7687499999999999 | 0 |
| 0.7694444444444444 | 0 |
| 0.7701388888888889 | 0 |
| 0.7708333333333334 | 0 |
| 0.7715277777777777 | 0 |
| 0.7722222222222223 | 0 |
| 0.7729166666666667 | 0 |
| 0.7736111111111111 | 0 |
| 0.7743055555555555 | 0 |
| 0.775 | 0 |
| 0.7756944444444445 | 0 |
| 0.7763888888888889 | 0 |
| 0.7770833333333332 | 0 |
| 0.7777777777777778 | 0 |
| 0.7784722222222222 | 0 |
| 0.7791666666666667 | 0 |
| 0.779861111111111 | 0 |
| 0.7805555555555556 | 0 |
| 0.78125 | 0 |
| 0.7819444444444444 | 0 |
| 0.782638888888889 | 0 |
| 0.7833333333333333 | 0 |
| 0.7840277777777778 | 0 |
| 0.7847222222222222 | 0 |
| 0.7854166666666668 | 0 |
| 0.7861111111111111 | 0 |
| 0.7868055555555555 | 0 |
| 0.7875 | 0 |
| 0.7881944444444445 | 0 |
| 0.7888888888888889 | 0 |
| 0.7895833333333333 | 0 |
| 0.7902777777777777 | 0 |
| 0.7909722222222223 | 0 |
| 0.7916666666666666 | 0 |
| 0.7923611111111111 | 0 |
| 0.7930555555555556 | 0 |
| 0.7937500000000001 | 0 |
| 0.7944444444444444 | 0 |
| 0.7951388888888888 | 0 |
| 0.7958333333333334 | 0 |
| 0.7965277777777778 | 0 |
| 0.7972222222222222 | 0 |
| 0.7979166666666666 | 0 |
| 0.7986111111111112 | 0 |
| 0.7993055555555556 | 0 |
| 0.7999999999999999 | 0 |
| 0.8006944444444444 | 0 |
| 0.8013888888888889 | 0 |
| 0.8020833333333334 | 0 |
| 0.8027777777777777 | 0 |
| 0.8034722222222223 | 0 |
| 0.8041666666666667 | 0 |
| 0.8048611111111111 | 0 |
| 0.8055555555555555 | 0 |
| 0.80625 | 0 |
| 0.8069444444444445 | 0 |
| 0.8076388888888889 | 0 |
| 0.8083333333333332 | 0 |
| 0.8090277777777778 | 0 |
| 0.8097222222222222 | 0 |
| 0.8104166666666667 | 0 |
| 0.811111111111111 | 0 |
| 0.8118055555555556 | 0 |
| 0.8125 | 0 |
| 0.8131944444444444 | 0 |
| 0.813888888888889 | 0 |
| 0.8145833333333333 | 0 |
| 0.8152777777777778 | 0 |
| 0.8159722222222222 | 0 |
| 0.8166666666666668 | 0 |
| 0.8173611111111111 | 0 |
| 0.8180555555555555 | 0 |
| 0.81875 | 0 |
| 0.8194444444444445 | 0 |
| 0.8201388888888889 | 0 |
| 0.8208333333333333 | 0 |
| 0.8215277777777777 | 0 |
| 0.8222222222222223 | 0 |
| 0.8229166666666666 | 0 |
| 0.8236111111111111 | 0 |
| 0.8243055555555556 | 0 |
| 0.8250000000000001 | 0 |
| 0.8256944444444444 | 0 |
| 0.8263888888888888 | 0 |
| 0.8270833333333334 | 0 |
| 0.8277777777777778 | 0 |
| 0.8284722222222222 | 0 |
| 0.8291666666666666 | 0 |
| 0.8298611111111112 | 0 |
| 0.8305555555555556 | 0 |
| 0.8312499999999999 | 0 |
| 0.8319444444444444 | 0 |
| 0.8326388888888889 | 0 |
| 0.8333333333333334 | 0 |
| 0.8340277777777777 | 0 |
| 0.8347222222222223 | 0 |
| 0.8354166666666667 | 0 |
| 0.8361111111111111 | 0 |
| 0.8368055555555555 | 0 |
| 0.8375 | 0 |
| 0.8381944444444445 | 0 |
| 0.8388888888888889 | 0 |
| 0.8395833333333332 | 0 |
| 0.8402777777777778 | 0 |
| 0.8409722222222222 | 0 |
| 0.8416666666666667 | 0 |
| 0.842361111111111 | 0 |
| 0.8430555555555556 | 0 |
| 0.84375 | 0 |
| 0.8444444444444444 | 0 |
| 0.845138888888889 | 0 |
| 0.8458333333333333 | 0 |
| 0.8465277777777778 | 0 |
| 0.8472222222222222 | 0 |
| 0.8479166666666668 | 0 |
| 0.8486111111111111 | 0 |
| 0.8493055555555555 | 0 |
| 0.85 | 0 |
| 0.8506944444444445 | 0 |
| 0.8513888888888889 | 0 |
| 0.8520833333333333 | 0 |
| 0.8527777777777777 | 0 |
| 0.8534722222222223 | 0 |
| 0.8541666666666666 | 0 |
| 0.8548611111111111 | 0 |
| 0.8555555555555556 | 0 |
| 0.8562500000000001 | 0 |
| 0.8569444444444444 | 0 |
| 0.8576388888888888 | 0 |
| 0.8583333333333334 | 0 |
| 0.8590277777777778 | 0 |
| 0.8597222222222222 | 0 |
| 0.8604166666666666 | 0 |
| 0.8611111111111112 | 0 |
| 0.8618055555555556 | 0 |
| 0.8624999999999999 | 0 |
| 0.8631944444444444 | 0 |
| 0.8638888888888889 | 0 |
| 0.8645833333333334 | 0 |
| 0.8652777777777777 | 0 |
| 0.8659722222222223 | 0 |
| 0.8666666666666667 | 0 |
| 0.8673611111111111 | 0 |
| 0.8680555555555555 | 0 |
| 0.86875 | 0 |
| 0.8694444444444445 | 0 |
| 0.8701388888888889 | 0 |
| 0.8708333333333332 | 0 |
| 0.8715277777777778 | 0 |
| 0.8722222222222222 | 0 |
| 0.8729166666666667 | 0 |
| 0.873611111111111 | 0 |
| 0.8743055555555556 | 0 |
| 0.875 | 0 |
| 0.8756944444444444 | 0 |
| 0.876388888888889 | 0 |
| 0.8770833333333333 | 0 |
| 0.8777777777777778 | 0 |
| 0.8784722222222222 | 0 |
| 0.8791666666666668 | 0 |
| 0.8798611111111111 | 0 |
| 0.8805555555555555 | 0 |
| 0.88125 | 0 |
| 0.8819444444444445 | 0 |
| 0.8826388888888889 | 0 |
| 0.8833333333333333 | 0 |
| 0.8840277777777777 | 0 |
| 0.8847222222222223 | 0 |
| 0.8854166666666666 | 0 |
| 0.8861111111111111 | 0 |
| 0.8868055555555556 | 0 |
| 0.8875000000000001 | 0 |
| 0.8881944444444444 | 0 |
| 0.8888888888888888 | 0 |
| 0.8895833333333334 | 0 |
| 0.8902777777777778 | 0 |
| 0.8909722222222222 | 0 |
| 0.8916666666666666 | 0 |
| 0.8923611111111112 | 0 |
| 0.8930555555555556 | 0 |
| 0.8937499999999999 | 0 |
| 0.8944444444444444 | 0 |
| 0.8951388888888889 | 0 |
| 0.8958333333333334 | 0 |
| 0.8965277777777777 | 0 |
| 0.8972222222222223 | 0 |
| 0.8979166666666667 | 0 |
| 0.8986111111111111 | 0 |
| 0.8993055555555555 | 0 |
| 0.9 | 0 |
| 0.9006944444444445 | 0 |
| 0.9013888888888889 | 0 |
| 0.9020833333333332 | 0 |
| 0.9027777777777778 | 0 |
| 0.9034722222222222 | 0 |
| 0.9041666666666667 | 0 |
| 0.904861111111111 | 0 |
| 0.9055555555555556 | 0 |
| 0.90625 | 0 |
| 0.9069444444444444 | 0 |
| 0.907638888888889 | 0 |
| 0.9083333333333333 | 0 |
| 0.9090277777777778 | 0 |
| 0.9097222222222222 | 0 |
| 0.9104166666666668 | 0 |
| 0.9111111111111111 | 0 |
| 0.9118055555555555 | 0 |
| 0.9125 | 0 |
| 0.9131944444444445 | 0 |
| 0.9138888888888889 | 0 |
| 0.9145833333333333 | 0 |
| 0.9152777777777777 | 0 |
| 0.9159722222222223 | 0 |
| 0.9166666666666666 | 0 |
| 0.9173611111111111 | 0 |
| 0.9180555555555556 | 0 |
| 0.9187500000000001 | 0 |
| 0.9194444444444444 | 0 |
| 0.9201388888888888 | 0 |
| 0.9208333333333334 | 0 |
| 0.9215277777777778 | 0 |
| 0.9222222222222222 | 0 |
| 0.9229166666666666 | 0 |
| 0.9236111111111112 | 0 |
| 0.9243055555555556 | 0 |
| 0.9249999999999999 | 0 |
| 0.9256944444444444 | 0 |
| 0.9263888888888889 | 0 |
| 0.9270833333333334 | 0 |
| 0.9277777777777777 | 0 |
| 0.9284722222222223 | 0 |
| 0.9291666666666667 | 0 |
| 0.9298611111111111 | 0 |
| 0.9305555555555555 | 0 |
| 0.93125 | 0 |
| 0.9319444444444445 | 0 |
| 0.9326388888888889 | 0 |
| 0.9333333333333332 | 0 |
| 0.9340277777777778 | 0 |
| 0.9347222222222222 | 0 |
| 0.9354166666666667 | 0 |
| 0.936111111111111 | 0 |
| 0.9368055555555556 | 0 |
| 0.9375 | 0 |
| 0.9381944444444444 | 0 |
| 0.938888888888889 | 0 |
| 0.9395833333333333 | 0 |
| 0.9402777777777778 | 0 |
| 0.9409722222222222 | 0 |
| 0.9416666666666668 | 0 |
| 0.9423611111111111 | 0 |
| 0.9430555555555555 | 0 |
| 0.94375 | 0 |
| 0.9444444444444445 | 0 |
| 0.9451388888888889 | 0 |
| 0.9458333333333333 | 0 |
| 0.9465277777777777 | 0 |
| 0.9472222222222223 | 0 |
| 0.9479166666666666 | 0 |
| 0.9486111111111111 | 0 |
| 0.9493055555555556 | 0 |
| 0.9500000000000001 | 0 |
| 0.9506944444444444 | 0 |
| 0.9513888888888888 | 0 |
| 0.9520833333333334 | 0 |
| 0.9527777777777778 | 0 |
| 0.9534722222222222 | 0 |
| 0.9541666666666666 | 0 |
| 0.9548611111111112 | 0 |
| 0.9555555555555556 | 0 |
| 0.9562499999999999 | 0 |
| 0.9569444444444444 | 0 |
| 0.9576388888888889 | 0 |
| 0.9583333333333334 | 0 |
| 0.9590277777777777 | 0 |
| 0.9597222222222223 | 0 |
| 0.9604166666666667 | 0 |
| 0.9611111111111111 | 0 |
| 0.9618055555555555 | 0 |
| 0.9625 | 0 |
| 0.9631944444444445 | 0 |
| 0.9638888888888889 | 0 |
| 0.9645833333333332 | 0 |
| 0.9652777777777778 | 0 |
| 0.9659722222222222 | 0 |
| 0.9666666666666667 | 0 |
| 0.967361111111111 | 0 |
| 0.9680555555555556 | 0 |
| 0.96875 | 0 |
| 0.9694444444444444 | 0 |
| 0.970138888888889 | 0 |
| 0.9708333333333333 | 0 |
| 0.9715277777777778 | 0 |
| 0.9722222222222222 | 0 |
| 0.9729166666666668 | 0 |
| 0.9736111111111111 | 0 |
| 0.9743055555555555 | 0 |
| 0.975 | 0 |
| 0.9756944444444445 | 0 |
| 0.9763888888888889 | 0 |
| 0.9770833333333333 | 0 |
| 0.9777777777777777 | 0 |
| 0.9784722222222223 | 0 |
| 0.9791666666666666 | 0 |
| 0.9798611111111111 | 0 |
| 0.9805555555555556 | 0 |
| 0.9812500000000001 | 0 |
| 0.9819444444444444 | 0 |
| 0.9826388888888888 | 0 |
| 0.9833333333333334 | 0 |
| 0.9840277777777778 | 0 |
| 0.9847222222222222 | 0 |
| 0.9854166666666666 | 0 |
| 0.9861111111111112 | 0 |
| 0.9868055555555556 | 0 |
| 0.9874999999999999 | 0 |
| 0.9881944444444444 | 0 |
| 0.9888888888888889 | 0 |
| 0.9895833333333334 | 0 |
| 0.9902777777777777 | 0 |
| 0.9909722222222223 | 0 |
| 0.9916666666666667 | 0 |
| 0.9923611111111111 | 0 |
| 0.9930555555555555 | 0 |
| 0.99375 | 0 |
| 0.9944444444444445 | 0 |
| 0.9951388888888889 | 0 |
| 0.9958333333333332 | 0 |
| 0.9965277777777778 | 0 |
| 0.9972222222222222 | 0 |
| 0.9979166666666667 | 0 |
| 0.998611111111111 | 0 |
| 0.9993055555555556 | 0 |